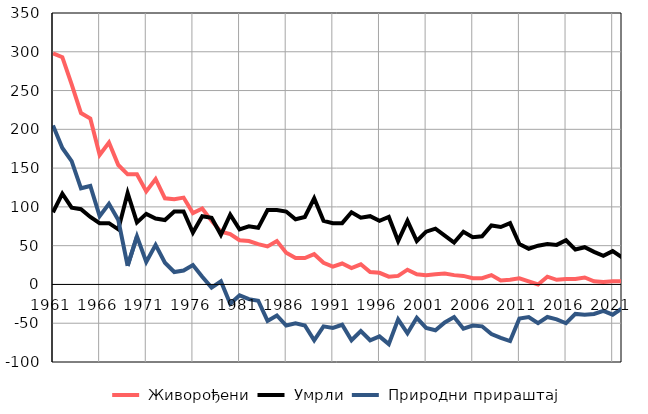
| Category |  Живорођени |  Умрли |  Природни прираштај |
|---|---|---|---|
| 1961.0 | 298 | 93 | 205 |
| 1962.0 | 293 | 117 | 176 |
| 1963.0 | 258 | 99 | 159 |
| 1964.0 | 221 | 97 | 124 |
| 1965.0 | 214 | 87 | 127 |
| 1966.0 | 167 | 79 | 88 |
| 1967.0 | 183 | 79 | 104 |
| 1968.0 | 154 | 71 | 83 |
| 1969.0 | 142 | 118 | 24 |
| 1970.0 | 142 | 80 | 62 |
| 1971.0 | 120 | 91 | 29 |
| 1972.0 | 136 | 85 | 51 |
| 1973.0 | 111 | 83 | 28 |
| 1974.0 | 110 | 94 | 16 |
| 1975.0 | 112 | 94 | 18 |
| 1976.0 | 92 | 67 | 25 |
| 1977.0 | 98 | 88 | 10 |
| 1978.0 | 82 | 86 | -4 |
| 1979.0 | 68 | 64 | 4 |
| 1980.0 | 65 | 90 | -25 |
| 1981.0 | 57 | 71 | -14 |
| 1982.0 | 56 | 75 | -19 |
| 1983.0 | 52 | 73 | -21 |
| 1984.0 | 49 | 96 | -47 |
| 1985.0 | 56 | 96 | -40 |
| 1986.0 | 41 | 94 | -53 |
| 1987.0 | 34 | 84 | -50 |
| 1988.0 | 34 | 87 | -53 |
| 1989.0 | 39 | 111 | -72 |
| 1990.0 | 28 | 82 | -54 |
| 1991.0 | 23 | 79 | -56 |
| 1992.0 | 27 | 79 | -52 |
| 1993.0 | 21 | 93 | -72 |
| 1994.0 | 26 | 86 | -60 |
| 1995.0 | 16 | 88 | -72 |
| 1996.0 | 15 | 82 | -67 |
| 1997.0 | 10 | 87 | -77 |
| 1998.0 | 11 | 56 | -45 |
| 1999.0 | 19 | 82 | -63 |
| 2000.0 | 13 | 56 | -43 |
| 2001.0 | 12 | 68 | -56 |
| 2002.0 | 13 | 72 | -59 |
| 2003.0 | 14 | 63 | -49 |
| 2004.0 | 12 | 54 | -42 |
| 2005.0 | 11 | 68 | -57 |
| 2006.0 | 8 | 61 | -53 |
| 2007.0 | 8 | 62 | -54 |
| 2008.0 | 12 | 76 | -64 |
| 2009.0 | 5 | 74 | -69 |
| 2010.0 | 6 | 79 | -73 |
| 2011.0 | 8 | 52 | -44 |
| 2012.0 | 4 | 46 | -42 |
| 2013.0 | 0 | 50 | -50 |
| 2014.0 | 10 | 52 | -42 |
| 2015.0 | 6 | 51 | -45 |
| 2016.0 | 7 | 57 | -50 |
| 2017.0 | 7 | 45 | -38 |
| 2018.0 | 9 | 48 | -39 |
| 2019.0 | 4 | 42 | -38 |
| 2020.0 | 3 | 37 | -34 |
| 2021.0 | 4 | 43 | -39 |
| 2022.0 | 4 | 35 | -31 |